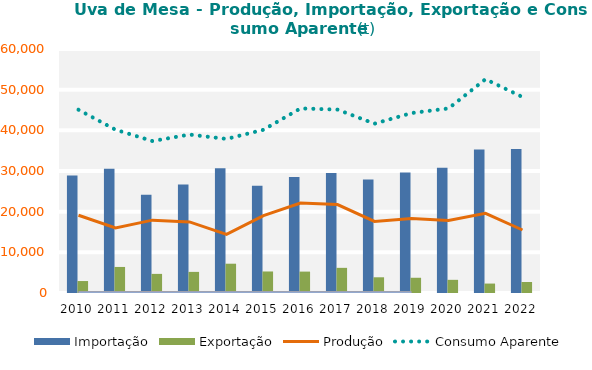
| Category | Importação | Exportação |
|---|---|---|
| 0 | 28881.9 | 2941.401 |
| 1 | 30569.79 | 6405.746 |
| 2 | 24148.107 | 4700.784 |
| 3 | 26671.35 | 5190.715 |
| 4 | 30653.868 | 7202.822 |
| 5 | 26401.905 | 5292.578 |
| 6 | 28519.68 | 5262.064 |
| 7 | 29536.719 | 6184.254 |
| 8 | 27915.068 | 3863.499 |
| 9 | 29654.275 | 3745.636 |
| 10 | 30775.172 | 3237.672 |
| 11 | 35288.691 | 2320.091 |
| 12 | 35411.908 | 2704.59 |